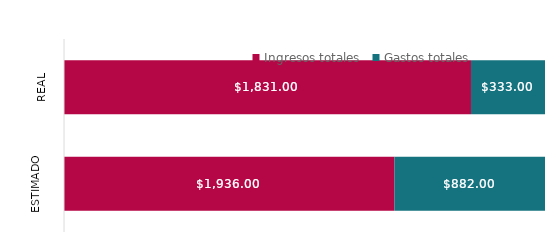
| Category | Ingresos totales | Gastos totales |
|---|---|---|
| Estimado | 1936 | 882 |
| Real | 1831 | 333 |